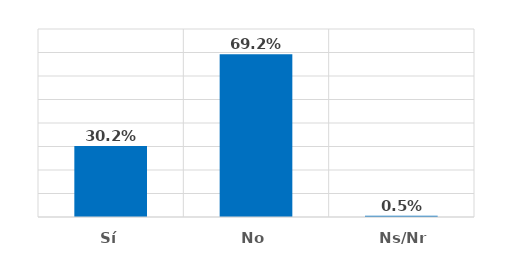
| Category | Series 0 |
|---|---|
| Sí | 0.302 |
| No | 0.692 |
| Ns/Nr | 0.005 |